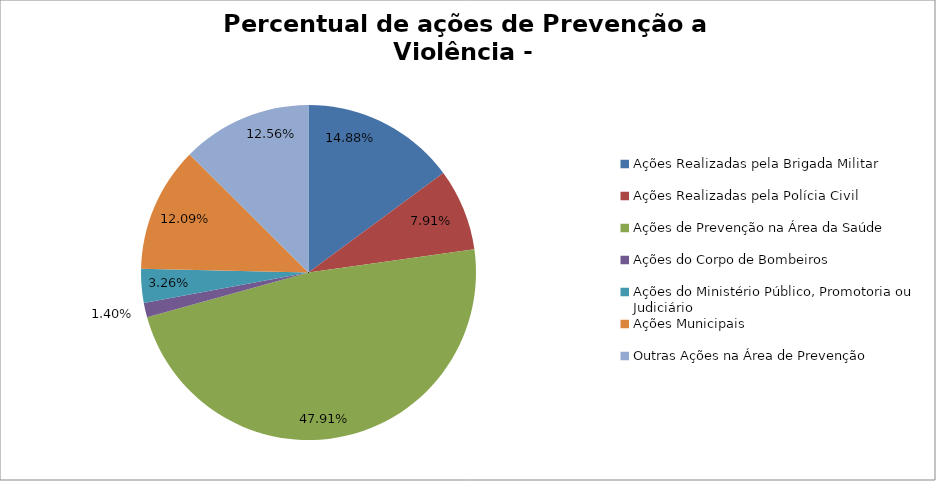
| Category | Percentual |
|---|---|
| Ações Realizadas pela Brigada Militar | 0.149 |
| Ações Realizadas pela Polícia Civil | 0.079 |
| Ações de Prevenção na Área da Saúde | 0.479 |
| Ações do Corpo de Bombeiros | 0.014 |
| Ações do Ministério Público, Promotoria ou Judiciário | 0.033 |
| Ações Municipais | 0.121 |
| Outras Ações na Área de Prevenção | 0.126 |